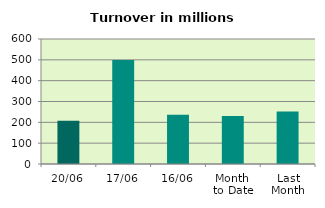
| Category | Series 0 |
|---|---|
| 20/06 | 207.974 |
| 17/06 | 499.478 |
| 16/06 | 236.584 |
| Month 
to Date | 230.795 |
| Last
Month | 251.573 |